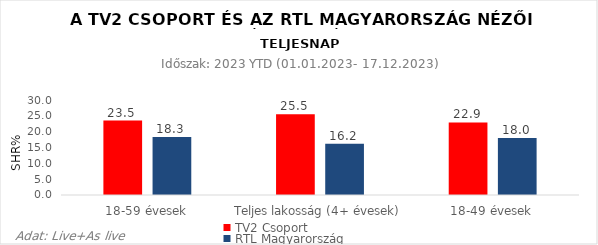
| Category | TV2 Csoport | RTL Magyarország |
|---|---|---|
| 18-59 évesek | 23.5 | 18.3 |
| Teljes lakosság (4+ évesek) | 25.5 | 16.2 |
| 18-49 évesek | 22.9 | 18 |